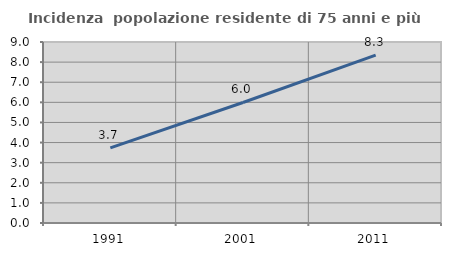
| Category | Incidenza  popolazione residente di 75 anni e più |
|---|---|
| 1991.0 | 3.734 |
| 2001.0 | 5.993 |
| 2011.0 | 8.345 |